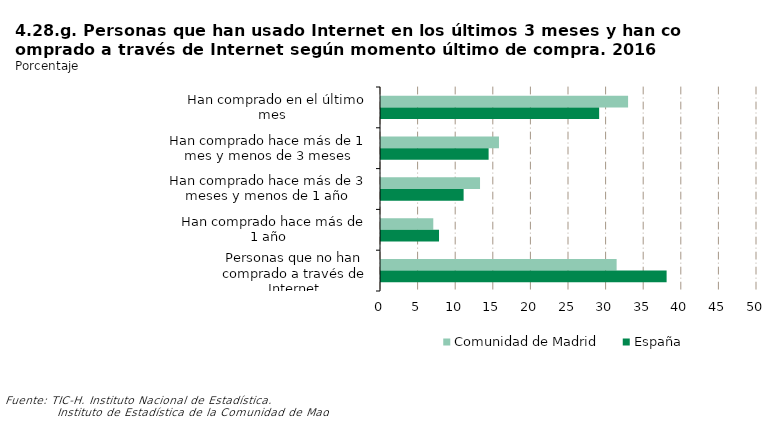
| Category | Comunidad de Madrid | España |
|---|---|---|
|    Han comprado en el último mes | 32.856 | 29.01 |
| Han comprado hace más de 1 mes y menos de 3 meses | 15.688 | 14.31 |
| Han comprado hace más de 3 meses y menos de 1 año | 13.169 | 10.985 |
|    Han comprado hace más de 1 año | 6.953 | 7.715 |
| Personas que no han comprado a través de Internet | 31.334 | 37.98 |